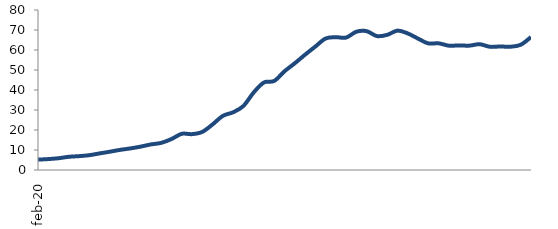
| Category | Series 0 |
|---|---|
| 2020-02-01 | 5.184 |
| 2020-03-01 | 5.46 |
| 2020-04-01 | 5.889 |
| 2020-05-01 | 6.605 |
| 2020-06-01 | 6.927 |
| 2020-07-01 | 7.406 |
| 2020-08-01 | 8.299 |
| 2020-09-01 | 9.152 |
| 2020-10-01 | 10.069 |
| 2020-11-01 | 10.796 |
| 2020-12-01 | 11.697 |
| 2021-01-01 | 12.797 |
| 2021-02-01 | 13.57 |
| 2021-03-01 | 15.495 |
| 2021-04-01 | 18.103 |
| 2021-05-01 | 17.934 |
| 2021-06-01 | 19.059 |
| 2021-07-01 | 22.8 |
| 2021-08-01 | 27.073 |
| 2021-09-01 | 28.874 |
| 2021-10-01 | 32.012 |
| 2021-11-01 | 38.773 |
| 2021-12-01 | 43.776 |
| 2022-01-01 | 44.54 |
| 2022-02-01 | 49.359 |
| 2022-03-01 | 53.359 |
| 2022-04-01 | 57.655 |
| 2022-05-01 | 61.711 |
| 2022-06-01 | 65.74 |
| 2022-07-01 | 66.408 |
| 2022-08-01 | 66.216 |
| 2022-09-01 | 69.145 |
| 2022-10-01 | 69.409 |
| 2022-11-01 | 66.96 |
| 2022-12-01 | 67.571 |
| 2023-01-01 | 69.689 |
| 2023-02-01 | 68.288 |
| 2023-03-01 | 65.704 |
| 2023-04-01 | 63.301 |
| 2023-05-01 | 63.346 |
| 2023-06-01 | 62.171 |
| 2023-07-01 | 62.286 |
| 2023-08-01 | 62.186 |
| 2023-09-01 | 62.894 |
| 2023-10-01 | 61.605 |
| 2023-11-01 | 61.76 |
| 2023-12-01 | 61.646 |
| 2024-01-01 | 62.622 |
| 2024-02-01 | 66.464 |